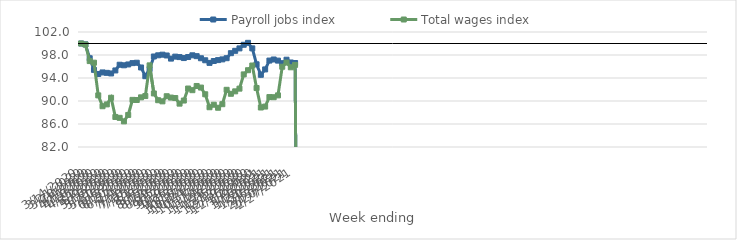
| Category | Payroll jobs index | Total wages index |
|---|---|---|
| 14/03/2020 | 100 | 100 |
| 21/03/2020 | 99.847 | 99.815 |
| 28/03/2020 | 97.435 | 96.942 |
| 04/04/2020 | 95.414 | 96.664 |
| 11/04/2020 | 94.697 | 90.979 |
| 18/04/2020 | 94.969 | 89.091 |
| 25/04/2020 | 94.896 | 89.409 |
| 02/05/2020 | 94.793 | 90.567 |
| 09/05/2020 | 95.314 | 87.221 |
| 16/05/2020 | 96.306 | 87.072 |
| 23/05/2020 | 96.211 | 86.457 |
| 30/05/2020 | 96.356 | 87.574 |
| 06/06/2020 | 96.588 | 90.196 |
| 13/06/2020 | 96.652 | 90.176 |
| 20/06/2020 | 95.829 | 90.635 |
| 27/06/2020 | 94.314 | 90.864 |
| 04/07/2020 | 95.551 | 96.197 |
| 11/07/2020 | 97.741 | 91.315 |
| 18/07/2020 | 97.947 | 90.137 |
| 25/07/2020 | 98.055 | 89.94 |
| 01/08/2020 | 97.917 | 90.83 |
| 08/08/2020 | 97.373 | 90.597 |
| 15/08/2020 | 97.717 | 90.517 |
| 22/08/2020 | 97.638 | 89.542 |
| 29/08/2020 | 97.47 | 90.081 |
| 05/09/2020 | 97.649 | 92.168 |
| 12/09/2020 | 97.947 | 91.882 |
| 19/09/2020 | 97.798 | 92.612 |
| 26/09/2020 | 97.434 | 92.335 |
| 03/10/2020 | 97.084 | 91.17 |
| 10/10/2020 | 96.629 | 88.915 |
| 17/10/2020 | 96.954 | 89.354 |
| 24/10/2020 | 97.112 | 88.828 |
| 31/10/2020 | 97.238 | 89.445 |
| 07/11/2020 | 97.444 | 91.948 |
| 14/11/2020 | 98.318 | 91.255 |
| 21/11/2020 | 98.728 | 91.677 |
| 28/11/2020 | 99.151 | 92.152 |
| 05/12/2020 | 99.778 | 94.627 |
| 12/12/2020 | 100.114 | 95.354 |
| 19/12/2020 | 99.154 | 96.166 |
| 26/12/2020 | 96.384 | 92.256 |
| 02/01/2021 | 94.555 | 88.867 |
| 09/01/2021 | 95.494 | 89.031 |
| 16/01/2021 | 97.031 | 90.683 |
| 23/01/2021 | 97.221 | 90.66 |
| 30/01/2021 | 97.024 | 90.977 |
| 06/02/2021 | 96.578 | 95.958 |
| 13/02/2021 | 97.18 | 96.686 |
| 20/02/2021 | 96.7 | 95.862 |
| 27/02/2021 | 96.608 | 96.277 |